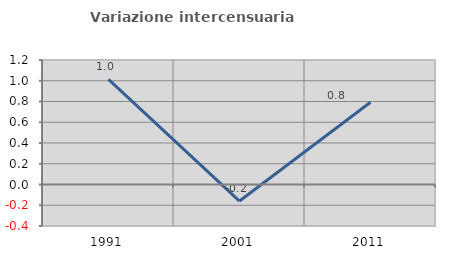
| Category | Variazione intercensuaria annua |
|---|---|
| 1991.0 | 1.013 |
| 2001.0 | -0.16 |
| 2011.0 | 0.793 |